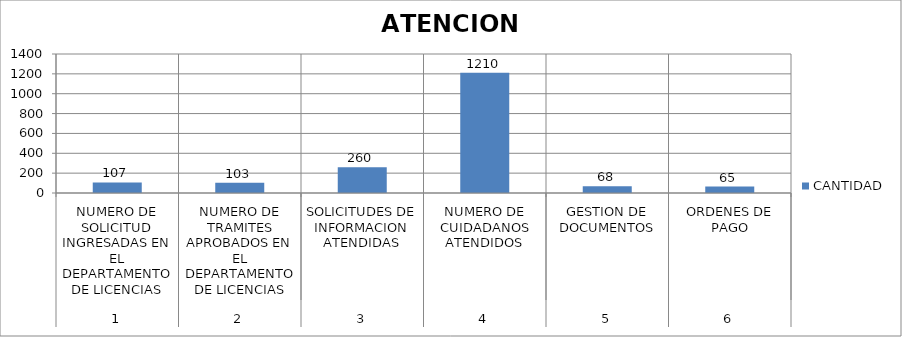
| Category | CANTIDAD |
|---|---|
| 0 | 107 |
| 1 | 103 |
| 2 | 260 |
| 3 | 1210 |
| 4 | 68 |
| 5 | 65 |